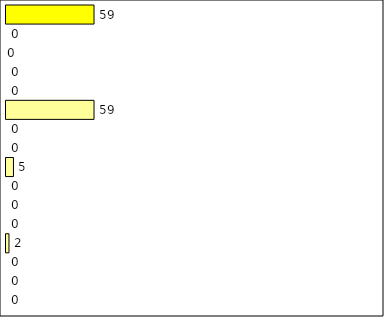
| Category | -2 | -1 | 0 | 1 | 2 | 3 | 4 | 5 | 6 | 7 | 8 | 9 | 10 | 11 | 12 | Perfect Round |
|---|---|---|---|---|---|---|---|---|---|---|---|---|---|---|---|---|
| 0 | 0 | 0 | 0 | 2 | 0 | 0 | 0 | 5 | 0 | 0 | 59 | 0 | 0 | 0 | 0 | 59 |